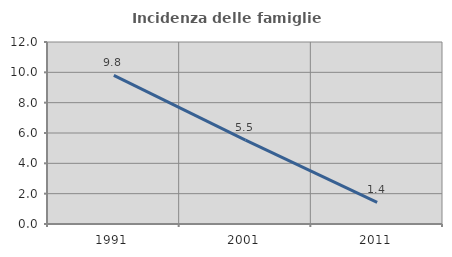
| Category | Incidenza delle famiglie numerose |
|---|---|
| 1991.0 | 9.799 |
| 2001.0 | 5.528 |
| 2011.0 | 1.432 |